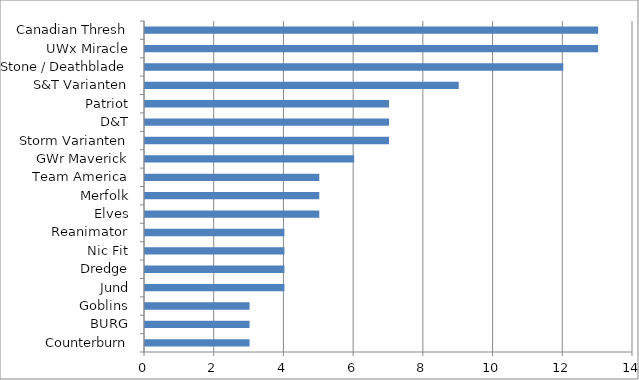
| Category | Series 0 |
|---|---|
| Counterburn | 3 |
| BURG | 3 |
| Goblins | 3 |
| Jund | 4 |
| Dredge | 4 |
| Nic Fit | 4 |
| Reanimator | 4 |
| Elves | 5 |
| Merfolk | 5 |
| Team America | 5 |
| GWr Maverick | 6 |
| Storm Varianten | 7 |
| D&T | 7 |
| Patriot | 7 |
| S&T Varianten | 9 |
| Stone / Deathblade | 12 |
| UWx Miracle | 13 |
| Canadian Thresh | 13 |